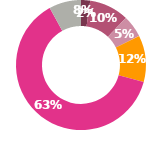
| Category | Series 0 |
|---|---|
| 0 | 13.998 |
| 1 | 60.673 |
| 2 | 33.894 |
| 3 | 71.685 |
| 4 | 387.232 |
| 5 | 0 |
| 6 | 49.172 |